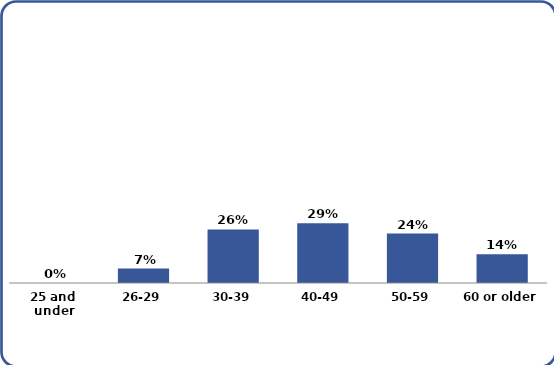
| Category | Series 0 |
|---|---|
| 25 and under | 0 |
| 26-29 | 0.07 |
| 30-39 | 0.26 |
| 40-49 | 0.29 |
| 50-59 | 0.24 |
| 60 or older | 0.14 |